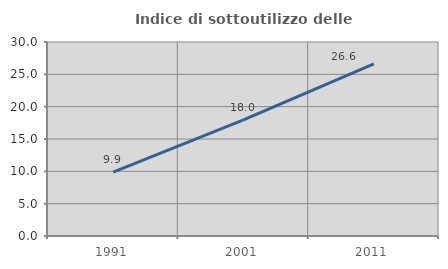
| Category | Indice di sottoutilizzo delle abitazioni  |
|---|---|
| 1991.0 | 9.89 |
| 2001.0 | 17.955 |
| 2011.0 | 26.62 |